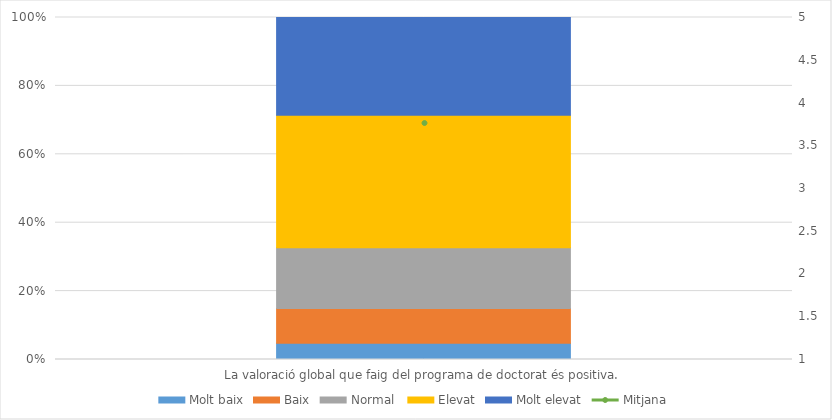
| Category | Molt baix | Baix | Normal  | Elevat | Molt elevat |
|---|---|---|---|---|---|
| La valoració global que faig del programa de doctorat és positiva. | 15 | 32 | 56 | 122 | 90 |